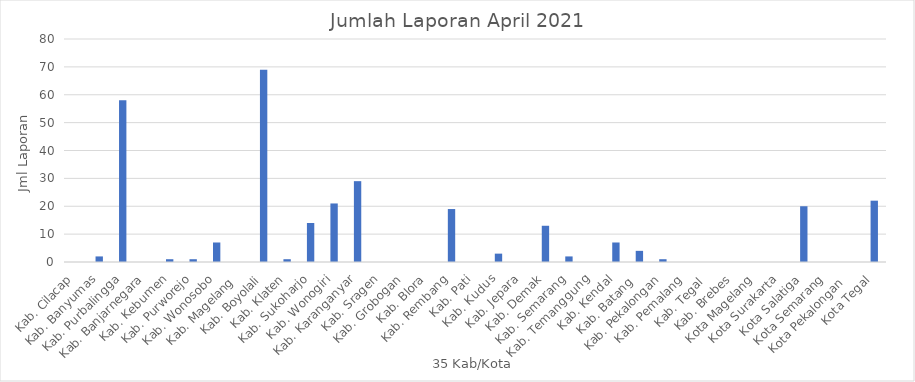
| Category | Series 0 |
|---|---|
| Kab. Cilacap | 0 |
| Kab. Banyumas | 2 |
| Kab. Purbalingga | 58 |
| Kab. Banjarnegara | 0 |
| Kab. Kebumen | 1 |
| Kab. Purworejo | 1 |
| Kab. Wonosobo | 7 |
| Kab. Magelang  | 0 |
| Kab. Boyolali | 69 |
| Kab. Klaten | 1 |
| Kab. Sukoharjo | 14 |
| Kab. Wonogiri | 21 |
| Kab. Karanganyar | 29 |
| Kab. Sragen | 0 |
| Kab. Grobogan | 0 |
| Kab. Blora | 0 |
| Kab. Rembang | 19 |
| Kab. Pati | 0 |
| Kab. Kudus | 3 |
| Kab. Jepara | 0 |
| Kab. Demak | 13 |
| Kab. Semarang | 2 |
| Kab. Temanggung | 0 |
| Kab. Kendal | 7 |
| Kab. Batang  | 4 |
| Kab. Pekalongan | 1 |
| Kab. Pemalang | 0 |
| Kab. Tegal  | 0 |
| Kab. Brebes | 0 |
| Kota Magelang | 0 |
| Kota Surakarta | 0 |
| Kota Salatiga | 20 |
| Kota Semarang | 0 |
| Kota Pekalongan  | 0 |
| Kota Tegal | 22 |